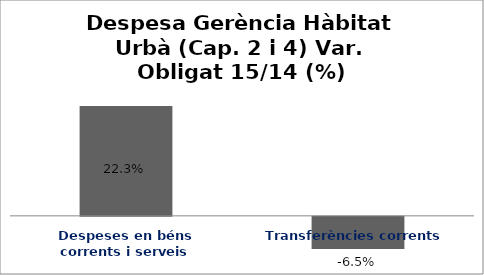
| Category | Series 0 |
|---|---|
| Despeses en béns corrents i serveis | 0.223 |
| Transferències corrents | -0.065 |